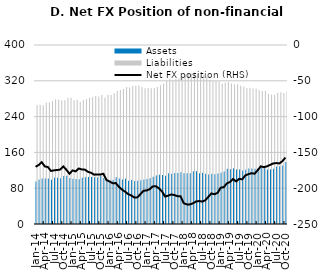
| Category | Assets | Liabilities |
|---|---|---|
| 2014-01-01 | 95.25 | 265.314 |
| 2014-02-01 | 98.608 | 266.298 |
| 2014-03-01 | 101.892 | 265.539 |
| 2014-04-01 | 101.647 | 271.202 |
| 2014-05-01 | 101.779 | 272.218 |
| 2014-06-01 | 98.902 | 274.859 |
| 2014-07-01 | 103.665 | 278.73 |
| 2014-08-01 | 103.247 | 277.852 |
| 2014-09-01 | 102.069 | 276.005 |
| 2014-10-01 | 107.28 | 276.812 |
| 2014-11-01 | 107.959 | 282.299 |
| 2014-12-01 | 102.547 | 282.361 |
| 2015-01-01 | 101.214 | 276.393 |
| 2015-02-01 | 100.759 | 277.236 |
| 2015-03-01 | 100.094 | 272.559 |
| 2015-04-01 | 103.624 | 277.373 |
| 2015-05-01 | 104.592 | 278.689 |
| 2015-06-01 | 105.178 | 282.316 |
| 2015-07-01 | 105.008 | 283.524 |
| 2015-08-01 | 104.673 | 285.763 |
| 2015-09-01 | 103.892 | 284.74 |
| 2015-10-01 | 107.641 | 288.542 |
| 2015-11-01 | 103.028 | 282.825 |
| 2015-12-01 | 100.172 | 288.859 |
| 2016-01-01 | 97.487 | 288.115 |
| 2016-02-01 | 99.021 | 292.088 |
| 2016-03-01 | 104.537 | 297.383 |
| 2016-04-01 | 101.752 | 299.699 |
| 2016-05-01 | 99.583 | 301.455 |
| 2016-06-01 | 101.257 | 306.014 |
| 2016-07-01 | 96.851 | 305.074 |
| 2016-08-01 | 98.329 | 308.401 |
| 2016-09-01 | 96.279 | 309.217 |
| 2016-10-01 | 96.478 | 309.271 |
| 2016-11-01 | 97.85 | 306.194 |
| 2016-12-01 | 99.58 | 303.095 |
| 2017-01-01 | 100.57 | 303.798 |
| 2017-02-01 | 102 | 303.317 |
| 2017-03-01 | 105.819 | 303.298 |
| 2017-04-01 | 108.646 | 305.993 |
| 2017-05-01 | 110.018 | 310.169 |
| 2017-06-01 | 109.528 | 314.187 |
| 2017-07-01 | 107.624 | 319.32 |
| 2017-08-01 | 113.361 | 323.674 |
| 2017-09-01 | 112.105 | 320.868 |
| 2017-10-01 | 114.149 | 323.753 |
| 2017-11-01 | 114.182 | 325.279 |
| 2017-12-01 | 115.866 | 327.148 |
| 2018-01-01 | 113.551 | 334.35 |
| 2018-02-01 | 113.151 | 335.775 |
| 2018-03-01 | 113.633 | 336.234 |
| 2018-04-01 | 117.615 | 338.768 |
| 2018-05-01 | 118.121 | 336.746 |
| 2018-06-01 | 113.396 | 331.353 |
| 2018-07-01 | 114.283 | 332.895 |
| 2018-08-01 | 112.376 | 329.355 |
| 2018-09-01 | 110.387 | 322.455 |
| 2018-10-01 | 112.093 | 319.407 |
| 2018-11-01 | 111.171 | 319.543 |
| 2018-12-01 | 112.656 | 319.173 |
| 2019-01-01 | 114.343 | 313.658 |
| 2019-02-01 | 117.423 | 316.016 |
| 2019-03-01 | 123.715 | 317.076 |
| 2019-04-01 | 122.49 | 313.821 |
| 2019-05-01 | 124.351 | 311.602 |
| 2019-06-01 | 121.65 | 312.127 |
| 2019-07-01 | 121.68 | 308.671 |
| 2019-08-01 | 119.542 | 307.118 |
| 2019-09-01 | 121.118 | 303.233 |
| 2019-10-01 | 123.883 | 304.234 |
| 2019-11-01 | 123.804 | 302.889 |
| 2019-12-01 | 123.222 | 302.99 |
| 2020-01-01 | 124.721 | 299.603 |
| 2020-02-01 | 127.81 | 297.319 |
| 2020-03-01 | 127.289 | 297.858 |
| 2020-04-01 | 121.511 | 291.024 |
| 2020-05-01 | 122.162 | 289.649 |
| 2020-06-01 | 123.334 | 288.811 |
| 2020-07-01 | 128.337 | 293.229 |
| 2020-08-01 | 129.253 | 294.678 |
| 2020-09-01 | 130.786 | 293.01 |
| 2020-10-01 | 138.813 | 296.047 |